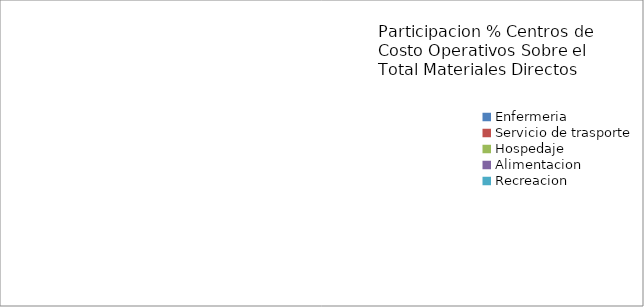
| Category | Series 13 |
|---|---|
| Enfermeria | 0 |
| Servicio de trasporte | 0 |
| Hospedaje | 0 |
| Alimentacion | 0 |
| Recreacion | 0 |